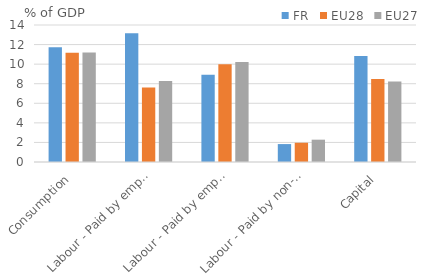
| Category | FR | EU28 | EU27 |
|---|---|---|---|
| Consumption | 11.725 | 11.162 | 11.186 |
| Labour - Paid by employers | 13.167 | 7.618 | 8.281 |
| Labour - Paid by employees | 8.911 | 9.997 | 10.231 |
| Labour - Paid by non-employed | 1.832 | 1.966 | 2.281 |
| Capital | 10.835 | 8.473 | 8.218 |